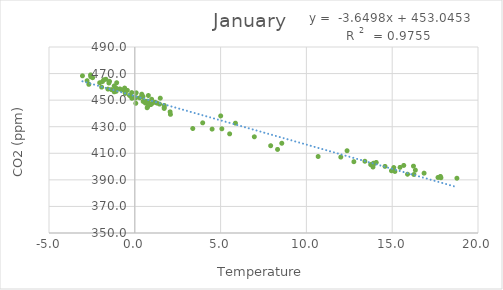
| Category | Series 0 |
|---|---|
| -0.8733333333329938 | 458.45 |
| -1.0558333333329983 | 463.098 |
| -1.681666666667013 | 465.712 |
| -2.459166666666988 | 466.88 |
| -2.5774999999999864 | 468.992 |
| -2.0475000000000136 | 463.085 |
| 0.4791666666670267 | 452.789 |
| 3.956666666666024 | 432.926 |
| 8.566666666667004 | 417.555 |
| 12.004166666667004 | 407.147 |
| 14.069999999999993 | 403.111 |
| 15.456666666666024 | 399.417 |
| 16.24000000000001 | 400.343 |
| 15.67416666666702 | 400.865 |
| 12.369166666667013 | 411.916 |
| 5.005833333332987 | 438.118 |
| 1.4850000000000136 | 451.472 |
| 1.4424999999999955 | 447.046 |
| 1.177500000000009 | 448.382 |
| 0.790833333333012 | 453.487 |
| 0.42333333333300516 | 452.739 |
| 0.4216666666670221 | 452.966 |
| 0.07999999999998408 | 455.504 |
| -0.17583333333300288 | 455.699 |
| -0.7591666666669994 | 457.69 |
| -0.43333333333299606 | 457.372 |
| -1.0958333333330188 | 459.135 |
| -1.1999999999999886 | 460.677 |
| -1.806666666667013 | 465.315 |
| -1.8799999999999955 | 464.027 |
| 0.7391666666670176 | 449.218 |
| 4.505833333332987 | 428.206 |
| 8.318333333332987 | 412.912 |
| 13.742500000000007 | 401.538 |
| 16.350000000000023 | 397.319 |
| 17.81166666666701 | 392.599 |
| 18.770833333332973 | 391.224 |
| 17.840833333333023 | 391.583 |
| 14.58166666666699 | 400.158 |
| 6.964999999999975 | 422.414 |
| 2.056666666667013 | 441.181 |
| 2.078333333332978 | 439.307 |
| 1.7116666666669857 | 443.754 |
| 0.9841666666670221 | 450.643 |
| 0.4049999999999727 | 454.481 |
| 0.6125000000000114 | 447.865 |
| 0.48750000000001137 | 449.013 |
| 0.29000000000002046 | 451.744 |
| -0.30666666666598985 | 453.493 |
| -0.039166666666972105 | 452.099 |
| -0.5708333333329847 | 456.404 |
| -1.1008333333330143 | 458.53 |
| -1.5091666666669994 | 462.9 |
| -1.4733333333330165 | 464.156 |
| 1.714999999999975 | 444.684 |
| 5.5266666666669835 | 424.627 |
| 10.683333333332996 | 407.583 |
| 13.880833333332987 | 399.655 |
| 13.948333333332982 | 402.238 |
| 14.957499999999982 | 396.85 |
| 15.893333333332976 | 394.233 |
| 15.157500000000027 | 396.338 |
| 12.765833333332978 | 403.65 |
| 5.865000000000009 | 432.68 |
| 1.7166666666669812 | 446.017 |
| 0.931666666667013 | 446.663 |
| 0.755833333332987 | 445.199 |
| 0.7816666666669789 | 448.216 |
| 0.6175000000000068 | 449.108 |
| 0.058333333334019244 | 447.639 |
| 0.054166666667015306 | 451.937 |
| -0.06416666666598303 | 451.874 |
| -0.5558333333329983 | 455.038 |
| -1.3616666666670199 | 457.939 |
| -1.2008333333329801 | 456.242 |
| -1.089999999999975 | 456.595 |
| -2.5658333333329892 | 467.674 |
| -2.7799999999999727 | 464.624 |
| -0.17333333333300516 | 451.384 |
| 3.3783333333329892 | 428.639 |
| 7.91833333333301 | 415.686 |
| 13.910000000000025 | 402.504 |
| 15.090833333333023 | 399.286 |
| 16.266666666666993 | 394.042 |
| 17.669166666667024 | 391.805 |
| 16.857500000000016 | 395.031 |
| 13.407500000000027 | 404.002 |
| 5.073333333332982 | 428.417 |
| 1.2916666666670267 | 447.75 |
| 0.9933333333329983 | 447.324 |
| 0.7174999999999727 | 444.266 |
| 0.0291666666669812 | 451.486 |
| -0.5916666666669812 | 459.094 |
| -1.5674999999999955 | 458.32 |
| -1.933333333332996 | 459.814 |
| -2.6791666666670153 | 461.895 |
| -3.0500000000000114 | 468.304 |